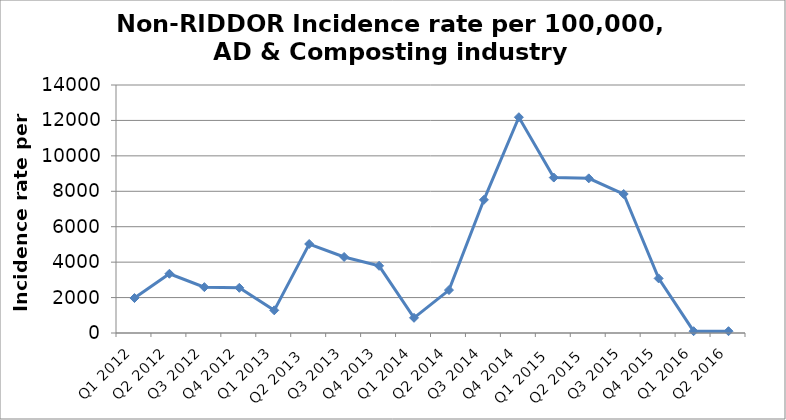
| Category | Series 0 |
|---|---|
| Q1 2012 | 1973.684 |
| Q2 2012 | 3344.121 |
| Q3 2012 | 2588.997 |
| Q4 2012 | 2550.336 |
| Q1 2013 | 1280 |
| Q2 2013  | 5024.311 |
| Q3 2013 | 4292.528 |
| Q4 2013 | 3791.983 |
| Q1 2014 | 857.449 |
| Q2 2014 | 2424.242 |
| Q3 2014 | 7517.73 |
| Q4 2014 | 12180.451 |
| Q1 2015  | 8774.834 |
| Q2 2015  | 8730.159 |
| Q3 2015 | 7845.934 |
| Q4 2015 | 3082.192 |
| Q1 2016 | 101.523 |
| Q2 2016 | 101.523 |